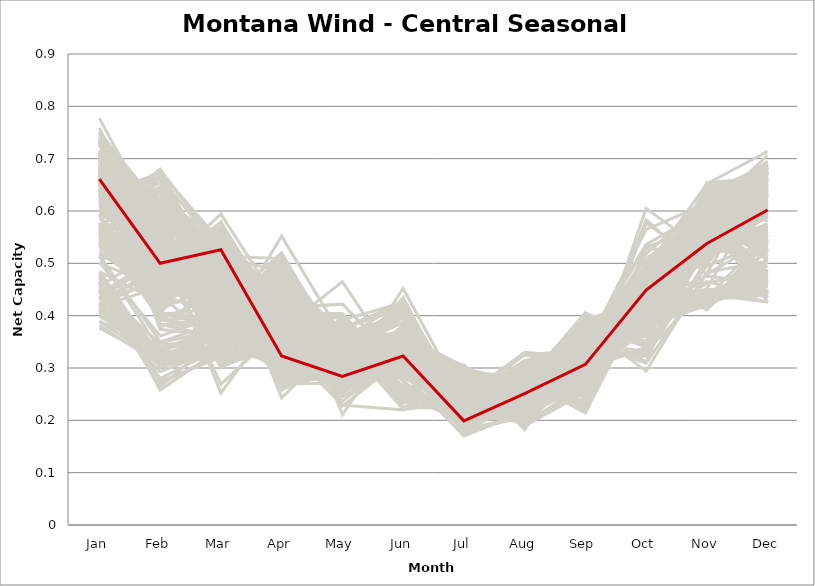
| Category | sample_001 | sample_002 | sample_003 | sample_004 | sample_005 | sample_006 | sample_007 | sample_008 | sample_009 | sample_010 | sample_011 | sample_012 | sample_013 | sample_014 | sample_015 | sample_016 | sample_017 | sample_018 | sample_019 | sample_020 | sample_021 | sample_022 | sample_023 | sample_024 | sample_025 | sample_026 | sample_027 | sample_028 | sample_029 | sample_030 | sample_031 | sample_032 | sample_033 | sample_034 | sample_035 | sample_036 | sample_037 | sample_038 | sample_039 | sample_040 | sample_041 | sample_042 | sample_043 | sample_044 | sample_045 | sample_046 | sample_047 | sample_048 | sample_049 | sample_050 | sample_051 | sample_052 | sample_053 | sample_054 | sample_055 | sample_056 | sample_057 | sample_058 | sample_059 | sample_060 | sample_061 | sample_062 | sample_063 | sample_064 | sample_065 | sample_066 | sample_067 | sample_068 | sample_069 | sample_070 | sample_071 | sample_072 | sample_073 | sample_074 | sample_075 | sample_076 | sample_077 | sample_078 | sample_079 | sample_080 | sample_081 | sample_082 | sample_083 | sample_084 | sample_085 | sample_086 | sample_087 | sample_088 | sample_089 | sample_090 | sample_091 | sample_092 | sample_093 | sample_094 | sample_095 | sample_096 | sample_097 | sample_098 | sample_099 | sample_100 | sample_101 | sample_102 | sample_103 | sample_104 | sample_105 | sample_106 | sample_107 | sample_108 | sample_109 | sample_110 | sample_111 | sample_112 | sample_113 | sample_114 | sample_115 | sample_116 | sample_117 | sample_118 | sample_119 | sample_120 | sample_121 | sample_122 | sample_123 | sample_124 | sample_125 | sample_126 | sample_127 | sample_128 | sample_129 | sample_130 | sample_131 | sample_132 | sample_133 | sample_134 | sample_135 | sample_136 | sample_137 | sample_138 | sample_139 | sample_140 | sample_141 | sample_142 | sample_143 | sample_144 | sample_145 | sample_146 | sample_147 | sample_148 | sample_149 | sample_150 | sample_151 | sample_152 | sample_153 | sample_154 | sample_155 | sample_156 | sample_157 | sample_158 | sample_159 | sample_160 | sample_161 | sample_162 | sample_163 | sample_164 | sample_165 | sample_166 | sample_167 | sample_168 | sample_169 | sample_170 | sample_171 | sample_172 | sample_173 | sample_174 | sample_175 | sample_176 | sample_177 | sample_178 | sample_179 | sample_180 | sample_181 | sample_182 | sample_183 | sample_184 | sample_185 | sample_186 | sample_187 | sample_188 | sample_189 | sample_190 | sample_191 | sample_192 | sample_193 | sample_194 | sample_195 | sample_196 | sample_197 | sample_198 | sample_199 | sample_200 | sample_201 | sample_202 | sample_203 | sample_204 | sample_205 | sample_206 | sample_207 | sample_208 | sample_209 | sample_210 | sample_211 | sample_212 | sample_213 | sample_214 | sample_215 | sample_216 | sample_217 | sample_218 | sample_219 | sample_220 | sample_221 | sample_222 | sample_223 | sample_224 | sample_225 | sample_226 | sample_227 | sample_228 | sample_229 | sample_230 | sample_231 | sample_232 | sample_233 | sample_234 | sample_235 | sample_236 | sample_237 | sample_238 | sample_239 | sample_240 | sample_241 | sample_242 | sample_243 | sample_244 | sample_245 | sample_246 | sample_248 | sample_249 | sample_250 | sample_247 |
|---|---|---|---|---|---|---|---|---|---|---|---|---|---|---|---|---|---|---|---|---|---|---|---|---|---|---|---|---|---|---|---|---|---|---|---|---|---|---|---|---|---|---|---|---|---|---|---|---|---|---|---|---|---|---|---|---|---|---|---|---|---|---|---|---|---|---|---|---|---|---|---|---|---|---|---|---|---|---|---|---|---|---|---|---|---|---|---|---|---|---|---|---|---|---|---|---|---|---|---|---|---|---|---|---|---|---|---|---|---|---|---|---|---|---|---|---|---|---|---|---|---|---|---|---|---|---|---|---|---|---|---|---|---|---|---|---|---|---|---|---|---|---|---|---|---|---|---|---|---|---|---|---|---|---|---|---|---|---|---|---|---|---|---|---|---|---|---|---|---|---|---|---|---|---|---|---|---|---|---|---|---|---|---|---|---|---|---|---|---|---|---|---|---|---|---|---|---|---|---|---|---|---|---|---|---|---|---|---|---|---|---|---|---|---|---|---|---|---|---|---|---|---|---|---|---|---|---|---|---|---|---|---|---|---|---|---|---|---|---|---|---|---|---|---|---|---|---|---|---|---|
| Jan | 0.621 | 0.557 | 0.735 | 0.737 | 0.617 | 0.653 | 0.407 | 0.652 | 0.611 | 0.617 | 0.731 | 0.464 | 0.679 | 0.735 | 0.689 | 0.401 | 0.566 | 0.708 | 0.647 | 0.686 | 0.565 | 0.466 | 0.376 | 0.615 | 0.647 | 0.456 | 0.674 | 0.637 | 0.403 | 0.737 | 0.569 | 0.703 | 0.543 | 0.635 | 0.535 | 0.485 | 0.417 | 0.399 | 0.44 | 0.649 | 0.662 | 0.609 | 0.734 | 0.559 | 0.777 | 0.456 | 0.675 | 0.632 | 0.571 | 0.556 | 0.462 | 0.48 | 0.626 | 0.602 | 0.5 | 0.669 | 0.664 | 0.736 | 0.652 | 0.711 | 0.515 | 0.432 | 0.436 | 0.726 | 0.619 | 0.641 | 0.615 | 0.532 | 0.432 | 0.615 | 0.647 | 0.636 | 0.668 | 0.551 | 0.594 | 0.751 | 0.585 | 0.643 | 0.632 | 0.55 | 0.665 | 0.623 | 0.711 | 0.666 | 0.619 | 0.641 | 0.611 | 0.732 | 0.666 | 0.688 | 0.657 | 0.455 | 0.437 | 0.418 | 0.647 | 0.746 | 0.652 | 0.573 | 0.586 | 0.537 | 0.616 | 0.657 | 0.701 | 0.684 | 0.657 | 0.678 | 0.448 | 0.561 | 0.521 | 0.659 | 0.605 | 0.674 | 0.636 | 0.632 | 0.694 | 0.546 | 0.715 | 0.654 | 0.732 | 0.647 | 0.728 | 0.54 | 0.527 | 0.56 | 0.464 | 0.381 | 0.614 | 0.569 | 0.649 | 0.671 | 0.659 | 0.619 | 0.659 | 0.635 | 0.658 | 0.633 | 0.455 | 0.63 | 0.534 | 0.656 | 0.54 | 0.434 | 0.682 | 0.665 | 0.7 | 0.735 | 0.672 | 0.654 | 0.759 | 0.475 | 0.411 | 0.426 | 0.75 | 0.441 | 0.664 | 0.674 | 0.569 | 0.605 | 0.684 | 0.641 | 0.429 | 0.627 | 0.705 | 0.553 | 0.64 | 0.389 | 0.646 | 0.389 | 0.409 | 0.671 | 0.547 | 0.578 | 0.577 | 0.7 | 0.547 | 0.556 | 0.643 | 0.745 | 0.567 | 0.54 | 0.412 | 0.54 | 0.573 | 0.7 | 0.661 | 0.666 | 0.665 | 0.683 | 0.661 | 0.594 | 0.564 | 0.613 | 0.741 | 0.594 | 0.512 | 0.423 | 0.548 | 0.41 | 0.451 | 0.716 | 0.539 | 0.513 | 0.64 | 0.659 | 0.484 | 0.59 | 0.664 | 0.687 | 0.64 | 0.588 | 0.707 | 0.535 | 0.621 | 0.564 | 0.67 | 0.417 | 0.675 | 0.502 | 0.447 | 0.648 | 0.733 | 0.588 | 0.422 | 0.653 | 0.572 | 0.601 | 0.682 | 0.644 | 0.606 | 0.609 | 0.68 | 0.601 | 0.595 | 0.726 | 0.656 | 0.571 | 0.674 | 0.619 | 0.543 | 0.655 | 0.629 | 0.672 | 0.562 | 0.697 | 0.515 | 0.472 | 0.674 | 0.553 | 0.729 | 0.661 |
| Feb | 0.46 | 0.439 | 0.538 | 0.406 | 0.661 | 0.524 | 0.311 | 0.44 | 0.677 | 0.57 | 0.59 | 0.315 | 0.448 | 0.523 | 0.48 | 0.314 | 0.604 | 0.379 | 0.476 | 0.586 | 0.466 | 0.32 | 0.315 | 0.495 | 0.51 | 0.529 | 0.503 | 0.621 | 0.323 | 0.609 | 0.493 | 0.526 | 0.402 | 0.559 | 0.424 | 0.317 | 0.318 | 0.332 | 0.508 | 0.438 | 0.475 | 0.623 | 0.4 | 0.394 | 0.564 | 0.32 | 0.488 | 0.421 | 0.517 | 0.404 | 0.33 | 0.313 | 0.559 | 0.667 | 0.454 | 0.43 | 0.437 | 0.59 | 0.621 | 0.539 | 0.35 | 0.48 | 0.327 | 0.564 | 0.567 | 0.537 | 0.617 | 0.473 | 0.465 | 0.653 | 0.507 | 0.524 | 0.51 | 0.501 | 0.405 | 0.605 | 0.507 | 0.622 | 0.672 | 0.513 | 0.515 | 0.665 | 0.392 | 0.456 | 0.536 | 0.617 | 0.535 | 0.383 | 0.571 | 0.443 | 0.577 | 0.345 | 0.348 | 0.305 | 0.663 | 0.589 | 0.476 | 0.5 | 0.643 | 0.409 | 0.586 | 0.624 | 0.577 | 0.459 | 0.538 | 0.544 | 0.28 | 0.415 | 0.439 | 0.424 | 0.598 | 0.472 | 0.42 | 0.43 | 0.382 | 0.487 | 0.545 | 0.542 | 0.516 | 0.555 | 0.584 | 0.432 | 0.466 | 0.466 | 0.318 | 0.308 | 0.608 | 0.436 | 0.493 | 0.518 | 0.489 | 0.526 | 0.604 | 0.486 | 0.501 | 0.644 | 0.317 | 0.665 | 0.509 | 0.471 | 0.419 | 0.506 | 0.512 | 0.466 | 0.438 | 0.555 | 0.479 | 0.573 | 0.512 | 0.258 | 0.338 | 0.329 | 0.566 | 0.516 | 0.496 | 0.612 | 0.55 | 0.632 | 0.488 | 0.504 | 0.491 | 0.412 | 0.456 | 0.663 | 0.514 | 0.338 | 0.536 | 0.314 | 0.315 | 0.483 | 0.501 | 0.419 | 0.468 | 0.487 | 0.543 | 0.5 | 0.553 | 0.594 | 0.416 | 0.406 | 0.293 | 0.468 | 0.444 | 0.532 | 0.447 | 0.576 | 0.472 | 0.374 | 0.492 | 0.56 | 0.598 | 0.583 | 0.598 | 0.646 | 0.486 | 0.302 | 0.44 | 0.334 | 0.264 | 0.453 | 0.501 | 0.334 | 0.516 | 0.537 | 0.426 | 0.6 | 0.577 | 0.383 | 0.51 | 0.68 | 0.392 | 0.431 | 0.592 | 0.478 | 0.515 | 0.455 | 0.518 | 0.361 | 0.27 | 0.624 | 0.54 | 0.635 | 0.47 | 0.479 | 0.639 | 0.621 | 0.557 | 0.555 | 0.675 | 0.597 | 0.605 | 0.549 | 0.523 | 0.589 | 0.56 | 0.582 | 0.491 | 0.66 | 0.498 | 0.464 | 0.444 | 0.562 | 0.431 | 0.455 | 0.518 | 0.275 | 0.494 | 0.433 | 0.594 | 0.5 |
| Mar | 0.534 | 0.502 | 0.314 | 0.393 | 0.476 | 0.428 | 0.333 | 0.55 | 0.536 | 0.449 | 0.328 | 0.336 | 0.423 | 0.269 | 0.555 | 0.362 | 0.537 | 0.401 | 0.54 | 0.346 | 0.525 | 0.341 | 0.349 | 0.535 | 0.521 | 0.455 | 0.39 | 0.532 | 0.366 | 0.302 | 0.481 | 0.533 | 0.385 | 0.421 | 0.526 | 0.344 | 0.346 | 0.377 | 0.436 | 0.495 | 0.386 | 0.531 | 0.417 | 0.44 | 0.319 | 0.337 | 0.555 | 0.508 | 0.443 | 0.543 | 0.34 | 0.318 | 0.542 | 0.466 | 0.491 | 0.501 | 0.519 | 0.381 | 0.548 | 0.547 | 0.388 | 0.463 | 0.343 | 0.404 | 0.382 | 0.416 | 0.45 | 0.468 | 0.476 | 0.445 | 0.411 | 0.407 | 0.402 | 0.472 | 0.548 | 0.315 | 0.477 | 0.514 | 0.542 | 0.481 | 0.538 | 0.522 | 0.375 | 0.544 | 0.551 | 0.549 | 0.473 | 0.386 | 0.421 | 0.554 | 0.44 | 0.35 | 0.375 | 0.34 | 0.486 | 0.388 | 0.552 | 0.488 | 0.455 | 0.534 | 0.457 | 0.391 | 0.333 | 0.579 | 0.41 | 0.384 | 0.339 | 0.539 | 0.343 | 0.504 | 0.428 | 0.52 | 0.488 | 0.525 | 0.38 | 0.508 | 0.535 | 0.386 | 0.561 | 0.422 | 0.307 | 0.533 | 0.463 | 0.503 | 0.359 | 0.361 | 0.483 | 0.532 | 0.401 | 0.427 | 0.579 | 0.476 | 0.424 | 0.53 | 0.387 | 0.436 | 0.33 | 0.413 | 0.456 | 0.422 | 0.538 | 0.438 | 0.391 | 0.56 | 0.404 | 0.494 | 0.399 | 0.404 | 0.301 | 0.337 | 0.356 | 0.34 | 0.305 | 0.447 | 0.523 | 0.403 | 0.484 | 0.526 | 0.375 | 0.43 | 0.468 | 0.462 | 0.421 | 0.441 | 0.555 | 0.367 | 0.566 | 0.344 | 0.386 | 0.536 | 0.468 | 0.539 | 0.53 | 0.594 | 0.448 | 0.433 | 0.395 | 0.312 | 0.537 | 0.538 | 0.338 | 0.519 | 0.537 | 0.421 | 0.514 | 0.397 | 0.568 | 0.359 | 0.383 | 0.529 | 0.54 | 0.507 | 0.357 | 0.36 | 0.475 | 0.332 | 0.473 | 0.362 | 0.362 | 0.511 | 0.508 | 0.381 | 0.562 | 0.416 | 0.426 | 0.491 | 0.424 | 0.358 | 0.541 | 0.522 | 0.398 | 0.538 | 0.439 | 0.518 | 0.39 | 0.423 | 0.53 | 0.401 | 0.328 | 0.44 | 0.252 | 0.44 | 0.457 | 0.398 | 0.435 | 0.455 | 0.432 | 0.395 | 0.466 | 0.425 | 0.41 | 0.446 | 0.488 | 0.391 | 0.401 | 0.515 | 0.408 | 0.467 | 0.487 | 0.545 | 0.536 | 0.4 | 0.46 | 0.57 | 0.41 | 0.32 | 0.417 | 0.537 | 0.302 | 0.526 |
| Apr | 0.4 | 0.318 | 0.369 | 0.326 | 0.388 | 0.497 | 0.358 | 0.295 | 0.397 | 0.333 | 0.327 | 0.434 | 0.284 | 0.376 | 0.331 | 0.502 | 0.343 | 0.348 | 0.315 | 0.301 | 0.291 | 0.381 | 0.478 | 0.284 | 0.301 | 0.391 | 0.475 | 0.398 | 0.514 | 0.347 | 0.285 | 0.393 | 0.373 | 0.297 | 0.286 | 0.421 | 0.486 | 0.514 | 0.42 | 0.371 | 0.502 | 0.374 | 0.301 | 0.302 | 0.362 | 0.363 | 0.336 | 0.317 | 0.272 | 0.259 | 0.379 | 0.391 | 0.428 | 0.397 | 0.316 | 0.373 | 0.342 | 0.325 | 0.376 | 0.433 | 0.404 | 0.335 | 0.438 | 0.34 | 0.425 | 0.329 | 0.304 | 0.306 | 0.355 | 0.422 | 0.293 | 0.382 | 0.475 | 0.277 | 0.274 | 0.347 | 0.266 | 0.412 | 0.365 | 0.301 | 0.32 | 0.353 | 0.363 | 0.309 | 0.401 | 0.391 | 0.298 | 0.341 | 0.342 | 0.397 | 0.451 | 0.422 | 0.469 | 0.435 | 0.402 | 0.352 | 0.314 | 0.258 | 0.367 | 0.261 | 0.292 | 0.485 | 0.328 | 0.39 | 0.465 | 0.467 | 0.398 | 0.279 | 0.415 | 0.36 | 0.424 | 0.335 | 0.332 | 0.31 | 0.334 | 0.284 | 0.426 | 0.447 | 0.415 | 0.339 | 0.344 | 0.258 | 0.322 | 0.317 | 0.456 | 0.472 | 0.376 | 0.261 | 0.279 | 0.327 | 0.335 | 0.276 | 0.474 | 0.315 | 0.459 | 0.444 | 0.386 | 0.481 | 0.303 | 0.323 | 0.272 | 0.424 | 0.509 | 0.343 | 0.301 | 0.465 | 0.5 | 0.358 | 0.387 | 0.409 | 0.491 | 0.39 | 0.361 | 0.413 | 0.331 | 0.475 | 0.347 | 0.34 | 0.507 | 0.444 | 0.314 | 0.399 | 0.3 | 0.343 | 0.406 | 0.467 | 0.413 | 0.494 | 0.5 | 0.346 | 0.26 | 0.264 | 0.294 | 0.414 | 0.323 | 0.288 | 0.459 | 0.356 | 0.294 | 0.243 | 0.44 | 0.284 | 0.296 | 0.352 | 0.509 | 0.459 | 0.413 | 0.315 | 0.494 | 0.413 | 0.327 | 0.382 | 0.303 | 0.552 | 0.316 | 0.439 | 0.324 | 0.496 | 0.421 | 0.486 | 0.275 | 0.41 | 0.405 | 0.486 | 0.287 | 0.351 | 0.344 | 0.317 | 0.315 | 0.38 | 0.313 | 0.273 | 0.431 | 0.279 | 0.517 | 0.421 | 0.382 | 0.408 | 0.425 | 0.448 | 0.412 | 0.375 | 0.317 | 0.494 | 0.325 | 0.391 | 0.359 | 0.486 | 0.376 | 0.417 | 0.48 | 0.302 | 0.27 | 0.288 | 0.462 | 0.339 | 0.51 | 0.404 | 0.29 | 0.32 | 0.31 | 0.351 | 0.314 | 0.382 | 0.283 | 0.421 | 0.52 | 0.303 | 0.362 | 0.323 |
| May | 0.353 | 0.313 | 0.292 | 0.344 | 0.298 | 0.311 | 0.349 | 0.284 | 0.324 | 0.279 | 0.332 | 0.314 | 0.393 | 0.327 | 0.287 | 0.258 | 0.334 | 0.323 | 0.289 | 0.329 | 0.297 | 0.345 | 0.28 | 0.31 | 0.306 | 0.276 | 0.36 | 0.296 | 0.27 | 0.32 | 0.294 | 0.376 | 0.465 | 0.385 | 0.339 | 0.311 | 0.28 | 0.267 | 0.295 | 0.246 | 0.349 | 0.303 | 0.366 | 0.328 | 0.298 | 0.343 | 0.279 | 0.265 | 0.315 | 0.363 | 0.344 | 0.346 | 0.323 | 0.309 | 0.318 | 0.252 | 0.261 | 0.342 | 0.314 | 0.375 | 0.404 | 0.277 | 0.311 | 0.341 | 0.275 | 0.376 | 0.26 | 0.338 | 0.277 | 0.299 | 0.391 | 0.281 | 0.346 | 0.314 | 0.345 | 0.329 | 0.289 | 0.32 | 0.351 | 0.289 | 0.281 | 0.345 | 0.325 | 0.277 | 0.336 | 0.301 | 0.267 | 0.339 | 0.379 | 0.339 | 0.338 | 0.326 | 0.275 | 0.289 | 0.289 | 0.342 | 0.281 | 0.315 | 0.306 | 0.358 | 0.289 | 0.333 | 0.342 | 0.355 | 0.355 | 0.359 | 0.373 | 0.337 | 0.422 | 0.236 | 0.27 | 0.287 | 0.268 | 0.292 | 0.35 | 0.297 | 0.392 | 0.35 | 0.346 | 0.362 | 0.332 | 0.352 | 0.325 | 0.313 | 0.279 | 0.257 | 0.318 | 0.355 | 0.399 | 0.356 | 0.28 | 0.287 | 0.352 | 0.292 | 0.356 | 0.361 | 0.343 | 0.367 | 0.29 | 0.378 | 0.338 | 0.283 | 0.34 | 0.27 | 0.392 | 0.275 | 0.321 | 0.355 | 0.317 | 0.374 | 0.266 | 0.337 | 0.311 | 0.285 | 0.278 | 0.341 | 0.229 | 0.329 | 0.319 | 0.302 | 0.29 | 0.245 | 0.391 | 0.334 | 0.333 | 0.268 | 0.337 | 0.271 | 0.267 | 0.266 | 0.313 | 0.361 | 0.305 | 0.327 | 0.273 | 0.313 | 0.309 | 0.297 | 0.329 | 0.355 | 0.288 | 0.313 | 0.329 | 0.355 | 0.211 | 0.347 | 0.333 | 0.358 | 0.325 | 0.319 | 0.341 | 0.312 | 0.354 | 0.359 | 0.306 | 0.282 | 0.314 | 0.255 | 0.375 | 0.227 | 0.303 | 0.395 | 0.341 | 0.313 | 0.346 | 0.33 | 0.353 | 0.369 | 0.29 | 0.349 | 0.364 | 0.341 | 0.265 | 0.301 | 0.317 | 0.292 | 0.375 | 0.398 | 0.347 | 0.26 | 0.297 | 0.314 | 0.295 | 0.334 | 0.349 | 0.304 | 0.37 | 0.29 | 0.305 | 0.258 | 0.345 | 0.28 | 0.271 | 0.364 | 0.331 | 0.351 | 0.336 | 0.292 | 0.306 | 0.279 | 0.282 | 0.358 | 0.323 | 0.358 | 0.288 | 0.361 | 0.324 | 0.325 | 0.32 | 0.284 |
| Jun | 0.369 | 0.295 | 0.289 | 0.25 | 0.347 | 0.32 | 0.343 | 0.317 | 0.355 | 0.33 | 0.305 | 0.328 | 0.243 | 0.265 | 0.329 | 0.309 | 0.298 | 0.252 | 0.334 | 0.327 | 0.352 | 0.357 | 0.29 | 0.345 | 0.316 | 0.364 | 0.335 | 0.37 | 0.293 | 0.304 | 0.417 | 0.425 | 0.291 | 0.225 | 0.297 | 0.32 | 0.305 | 0.297 | 0.365 | 0.302 | 0.334 | 0.365 | 0.249 | 0.344 | 0.294 | 0.344 | 0.327 | 0.319 | 0.298 | 0.297 | 0.363 | 0.34 | 0.41 | 0.341 | 0.367 | 0.324 | 0.329 | 0.336 | 0.353 | 0.426 | 0.276 | 0.366 | 0.314 | 0.334 | 0.283 | 0.24 | 0.319 | 0.353 | 0.37 | 0.338 | 0.256 | 0.29 | 0.338 | 0.318 | 0.301 | 0.298 | 0.31 | 0.357 | 0.348 | 0.41 | 0.339 | 0.347 | 0.257 | 0.317 | 0.422 | 0.36 | 0.329 | 0.245 | 0.237 | 0.404 | 0.371 | 0.337 | 0.307 | 0.322 | 0.351 | 0.339 | 0.329 | 0.318 | 0.359 | 0.296 | 0.309 | 0.358 | 0.294 | 0.427 | 0.356 | 0.346 | 0.345 | 0.288 | 0.303 | 0.33 | 0.327 | 0.322 | 0.327 | 0.32 | 0.25 | 0.361 | 0.425 | 0.354 | 0.413 | 0.234 | 0.292 | 0.303 | 0.349 | 0.295 | 0.314 | 0.316 | 0.354 | 0.292 | 0.248 | 0.261 | 0.336 | 0.32 | 0.353 | 0.314 | 0.344 | 0.355 | 0.337 | 0.362 | 0.435 | 0.264 | 0.304 | 0.362 | 0.337 | 0.338 | 0.245 | 0.327 | 0.339 | 0.246 | 0.267 | 0.332 | 0.291 | 0.338 | 0.279 | 0.357 | 0.322 | 0.355 | 0.22 | 0.369 | 0.328 | 0.318 | 0.381 | 0.317 | 0.242 | 0.336 | 0.396 | 0.304 | 0.415 | 0.301 | 0.308 | 0.319 | 0.311 | 0.282 | 0.365 | 0.395 | 0.452 | 0.318 | 0.352 | 0.295 | 0.325 | 0.297 | 0.319 | 0.368 | 0.299 | 0.221 | 0.378 | 0.351 | 0.387 | 0.242 | 0.332 | 0.413 | 0.306 | 0.294 | 0.323 | 0.384 | 0.363 | 0.317 | 0.356 | 0.309 | 0.341 | 0.319 | 0.366 | 0.274 | 0.415 | 0.32 | 0.329 | 0.354 | 0.251 | 0.252 | 0.339 | 0.338 | 0.242 | 0.286 | 0.316 | 0.349 | 0.339 | 0.352 | 0.415 | 0.275 | 0.333 | 0.31 | 0.283 | 0.349 | 0.368 | 0.337 | 0.341 | 0.346 | 0.226 | 0.351 | 0.34 | 0.33 | 0.331 | 0.322 | 0.328 | 0.344 | 0.365 | 0.299 | 0.333 | 0.347 | 0.399 | 0.323 | 0.325 | 0.237 | 0.342 | 0.408 | 0.315 | 0.333 | 0.355 | 0.302 | 0.31 | 0.323 |
| Jul | 0.197 | 0.235 | 0.24 | 0.228 | 0.27 | 0.268 | 0.257 | 0.187 | 0.273 | 0.268 | 0.243 | 0.265 | 0.202 | 0.253 | 0.181 | 0.234 | 0.235 | 0.211 | 0.183 | 0.234 | 0.219 | 0.248 | 0.248 | 0.2 | 0.214 | 0.295 | 0.279 | 0.278 | 0.244 | 0.246 | 0.214 | 0.215 | 0.17 | 0.223 | 0.225 | 0.254 | 0.246 | 0.239 | 0.298 | 0.2 | 0.29 | 0.251 | 0.212 | 0.255 | 0.241 | 0.248 | 0.182 | 0.193 | 0.244 | 0.234 | 0.257 | 0.257 | 0.2 | 0.278 | 0.257 | 0.198 | 0.188 | 0.224 | 0.241 | 0.226 | 0.18 | 0.291 | 0.264 | 0.222 | 0.213 | 0.24 | 0.306 | 0.259 | 0.276 | 0.296 | 0.198 | 0.2 | 0.284 | 0.24 | 0.231 | 0.238 | 0.256 | 0.277 | 0.266 | 0.216 | 0.202 | 0.264 | 0.228 | 0.192 | 0.197 | 0.262 | 0.25 | 0.217 | 0.237 | 0.2 | 0.272 | 0.263 | 0.249 | 0.267 | 0.279 | 0.232 | 0.191 | 0.227 | 0.245 | 0.242 | 0.286 | 0.293 | 0.241 | 0.199 | 0.285 | 0.297 | 0.263 | 0.221 | 0.174 | 0.201 | 0.207 | 0.18 | 0.206 | 0.192 | 0.225 | 0.223 | 0.235 | 0.287 | 0.193 | 0.236 | 0.247 | 0.231 | 0.263 | 0.247 | 0.258 | 0.241 | 0.278 | 0.24 | 0.201 | 0.199 | 0.183 | 0.248 | 0.284 | 0.213 | 0.288 | 0.284 | 0.268 | 0.262 | 0.215 | 0.204 | 0.231 | 0.303 | 0.299 | 0.196 | 0.204 | 0.297 | 0.272 | 0.228 | 0.252 | 0.277 | 0.242 | 0.263 | 0.252 | 0.297 | 0.2 | 0.291 | 0.261 | 0.259 | 0.286 | 0.27 | 0.283 | 0.197 | 0.214 | 0.284 | 0.199 | 0.245 | 0.207 | 0.241 | 0.232 | 0.197 | 0.235 | 0.24 | 0.214 | 0.202 | 0.238 | 0.224 | 0.264 | 0.242 | 0.232 | 0.225 | 0.27 | 0.225 | 0.228 | 0.234 | 0.245 | 0.291 | 0.211 | 0.221 | 0.297 | 0.192 | 0.25 | 0.24 | 0.237 | 0.243 | 0.256 | 0.259 | 0.276 | 0.243 | 0.28 | 0.302 | 0.217 | 0.195 | 0.2 | 0.264 | 0.267 | 0.278 | 0.238 | 0.227 | 0.208 | 0.284 | 0.224 | 0.238 | 0.214 | 0.219 | 0.29 | 0.289 | 0.217 | 0.182 | 0.269 | 0.209 | 0.25 | 0.259 | 0.285 | 0.294 | 0.271 | 0.277 | 0.254 | 0.275 | 0.273 | 0.211 | 0.3 | 0.249 | 0.259 | 0.226 | 0.27 | 0.244 | 0.292 | 0.273 | 0.218 | 0.193 | 0.194 | 0.229 | 0.259 | 0.203 | 0.214 | 0.274 | 0.294 | 0.234 | 0.245 | 0.199 |
| Aug | 0.253 | 0.301 | 0.203 | 0.272 | 0.275 | 0.243 | 0.273 | 0.247 | 0.24 | 0.219 | 0.196 | 0.255 | 0.284 | 0.196 | 0.237 | 0.304 | 0.193 | 0.281 | 0.246 | 0.198 | 0.264 | 0.271 | 0.326 | 0.251 | 0.242 | 0.255 | 0.235 | 0.284 | 0.33 | 0.201 | 0.234 | 0.227 | 0.216 | 0.281 | 0.282 | 0.252 | 0.278 | 0.325 | 0.23 | 0.249 | 0.237 | 0.276 | 0.278 | 0.277 | 0.194 | 0.274 | 0.237 | 0.244 | 0.226 | 0.255 | 0.26 | 0.272 | 0.252 | 0.271 | 0.28 | 0.232 | 0.241 | 0.201 | 0.249 | 0.216 | 0.206 | 0.276 | 0.271 | 0.203 | 0.213 | 0.258 | 0.208 | 0.275 | 0.279 | 0.278 | 0.292 | 0.206 | 0.238 | 0.208 | 0.253 | 0.201 | 0.228 | 0.277 | 0.235 | 0.235 | 0.249 | 0.234 | 0.276 | 0.242 | 0.262 | 0.269 | 0.218 | 0.271 | 0.276 | 0.24 | 0.256 | 0.258 | 0.288 | 0.294 | 0.269 | 0.208 | 0.249 | 0.204 | 0.273 | 0.259 | 0.195 | 0.264 | 0.2 | 0.244 | 0.244 | 0.24 | 0.26 | 0.291 | 0.212 | 0.238 | 0.216 | 0.238 | 0.244 | 0.246 | 0.278 | 0.254 | 0.218 | 0.248 | 0.226 | 0.265 | 0.205 | 0.265 | 0.289 | 0.288 | 0.277 | 0.305 | 0.276 | 0.254 | 0.291 | 0.276 | 0.238 | 0.214 | 0.266 | 0.237 | 0.244 | 0.239 | 0.253 | 0.278 | 0.227 | 0.279 | 0.282 | 0.243 | 0.229 | 0.25 | 0.281 | 0.202 | 0.24 | 0.261 | 0.195 | 0.25 | 0.31 | 0.257 | 0.201 | 0.253 | 0.249 | 0.264 | 0.277 | 0.29 | 0.246 | 0.254 | 0.27 | 0.251 | 0.288 | 0.278 | 0.251 | 0.326 | 0.254 | 0.314 | 0.309 | 0.241 | 0.214 | 0.258 | 0.256 | 0.247 | 0.214 | 0.21 | 0.232 | 0.203 | 0.259 | 0.257 | 0.285 | 0.239 | 0.278 | 0.256 | 0.215 | 0.259 | 0.257 | 0.281 | 0.234 | 0.27 | 0.189 | 0.194 | 0.191 | 0.308 | 0.275 | 0.285 | 0.285 | 0.298 | 0.26 | 0.182 | 0.236 | 0.218 | 0.262 | 0.242 | 0.288 | 0.281 | 0.264 | 0.285 | 0.25 | 0.241 | 0.272 | 0.274 | 0.203 | 0.256 | 0.235 | 0.24 | 0.232 | 0.209 | 0.262 | 0.209 | 0.196 | 0.286 | 0.282 | 0.24 | 0.27 | 0.27 | 0.262 | 0.236 | 0.262 | 0.206 | 0.264 | 0.22 | 0.224 | 0.205 | 0.25 | 0.193 | 0.237 | 0.274 | 0.241 | 0.25 | 0.256 | 0.273 | 0.28 | 0.237 | 0.196 | 0.253 | 0.23 | 0.284 | 0.2 | 0.251 |
| Sep | 0.381 | 0.243 | 0.349 | 0.326 | 0.231 | 0.29 | 0.394 | 0.328 | 0.271 | 0.356 | 0.331 | 0.389 | 0.339 | 0.348 | 0.328 | 0.36 | 0.27 | 0.359 | 0.317 | 0.319 | 0.302 | 0.378 | 0.333 | 0.275 | 0.272 | 0.356 | 0.282 | 0.233 | 0.32 | 0.35 | 0.331 | 0.307 | 0.269 | 0.294 | 0.266 | 0.363 | 0.364 | 0.324 | 0.351 | 0.332 | 0.291 | 0.233 | 0.332 | 0.377 | 0.351 | 0.373 | 0.308 | 0.369 | 0.353 | 0.282 | 0.378 | 0.371 | 0.293 | 0.219 | 0.395 | 0.356 | 0.366 | 0.293 | 0.24 | 0.313 | 0.281 | 0.389 | 0.377 | 0.293 | 0.345 | 0.275 | 0.333 | 0.37 | 0.391 | 0.229 | 0.311 | 0.393 | 0.291 | 0.351 | 0.289 | 0.334 | 0.353 | 0.214 | 0.286 | 0.321 | 0.303 | 0.282 | 0.324 | 0.323 | 0.298 | 0.246 | 0.363 | 0.325 | 0.279 | 0.319 | 0.256 | 0.383 | 0.357 | 0.354 | 0.222 | 0.283 | 0.31 | 0.351 | 0.251 | 0.287 | 0.368 | 0.305 | 0.345 | 0.307 | 0.276 | 0.282 | 0.351 | 0.264 | 0.265 | 0.352 | 0.311 | 0.322 | 0.345 | 0.357 | 0.345 | 0.319 | 0.314 | 0.294 | 0.276 | 0.272 | 0.344 | 0.289 | 0.361 | 0.252 | 0.354 | 0.361 | 0.219 | 0.304 | 0.302 | 0.291 | 0.308 | 0.364 | 0.294 | 0.269 | 0.285 | 0.325 | 0.398 | 0.316 | 0.346 | 0.289 | 0.274 | 0.351 | 0.299 | 0.321 | 0.331 | 0.31 | 0.297 | 0.269 | 0.334 | 0.349 | 0.34 | 0.373 | 0.338 | 0.353 | 0.292 | 0.302 | 0.375 | 0.232 | 0.29 | 0.301 | 0.406 | 0.358 | 0.332 | 0.221 | 0.307 | 0.33 | 0.307 | 0.348 | 0.349 | 0.304 | 0.363 | 0.279 | 0.3 | 0.305 | 0.352 | 0.357 | 0.295 | 0.341 | 0.283 | 0.298 | 0.361 | 0.319 | 0.265 | 0.28 | 0.346 | 0.279 | 0.321 | 0.343 | 0.307 | 0.293 | 0.254 | 0.263 | 0.304 | 0.316 | 0.389 | 0.353 | 0.368 | 0.36 | 0.346 | 0.345 | 0.324 | 0.266 | 0.302 | 0.296 | 0.385 | 0.226 | 0.278 | 0.345 | 0.266 | 0.28 | 0.346 | 0.284 | 0.281 | 0.305 | 0.287 | 0.344 | 0.309 | 0.269 | 0.368 | 0.302 | 0.335 | 0.254 | 0.382 | 0.296 | 0.229 | 0.229 | 0.267 | 0.304 | 0.228 | 0.301 | 0.33 | 0.365 | 0.35 | 0.286 | 0.273 | 0.261 | 0.288 | 0.231 | 0.338 | 0.33 | 0.351 | 0.263 | 0.36 | 0.305 | 0.36 | 0.351 | 0.299 | 0.258 | 0.349 | 0.307 |
| Oct | 0.294 | 0.462 | 0.456 | 0.485 | 0.485 | 0.498 | 0.38 | 0.452 | 0.396 | 0.418 | 0.448 | 0.402 | 0.455 | 0.536 | 0.453 | 0.446 | 0.411 | 0.496 | 0.435 | 0.456 | 0.336 | 0.406 | 0.449 | 0.442 | 0.468 | 0.348 | 0.417 | 0.433 | 0.464 | 0.442 | 0.327 | 0.431 | 0.503 | 0.437 | 0.441 | 0.398 | 0.441 | 0.472 | 0.39 | 0.486 | 0.429 | 0.446 | 0.469 | 0.421 | 0.442 | 0.39 | 0.455 | 0.448 | 0.471 | 0.41 | 0.395 | 0.407 | 0.464 | 0.488 | 0.351 | 0.466 | 0.451 | 0.416 | 0.412 | 0.406 | 0.583 | 0.344 | 0.416 | 0.425 | 0.417 | 0.399 | 0.422 | 0.402 | 0.349 | 0.493 | 0.459 | 0.425 | 0.412 | 0.47 | 0.385 | 0.443 | 0.472 | 0.443 | 0.393 | 0.327 | 0.434 | 0.408 | 0.488 | 0.453 | 0.452 | 0.44 | 0.469 | 0.498 | 0.425 | 0.431 | 0.428 | 0.404 | 0.457 | 0.422 | 0.471 | 0.407 | 0.442 | 0.458 | 0.498 | 0.4 | 0.418 | 0.397 | 0.455 | 0.432 | 0.406 | 0.413 | 0.384 | 0.447 | 0.528 | 0.48 | 0.392 | 0.445 | 0.457 | 0.44 | 0.477 | 0.33 | 0.414 | 0.403 | 0.464 | 0.414 | 0.441 | 0.412 | 0.427 | 0.471 | 0.425 | 0.427 | 0.459 | 0.371 | 0.455 | 0.444 | 0.452 | 0.465 | 0.381 | 0.472 | 0.41 | 0.386 | 0.402 | 0.41 | 0.332 | 0.457 | 0.43 | 0.37 | 0.439 | 0.453 | 0.45 | 0.492 | 0.465 | 0.435 | 0.518 | 0.375 | 0.459 | 0.384 | 0.464 | 0.36 | 0.446 | 0.395 | 0.312 | 0.438 | 0.463 | 0.49 | 0.345 | 0.484 | 0.453 | 0.486 | 0.441 | 0.452 | 0.443 | 0.458 | 0.445 | 0.47 | 0.476 | 0.401 | 0.34 | 0.449 | 0.309 | 0.489 | 0.454 | 0.449 | 0.373 | 0.376 | 0.423 | 0.333 | 0.44 | 0.41 | 0.509 | 0.413 | 0.438 | 0.473 | 0.431 | 0.485 | 0.436 | 0.436 | 0.424 | 0.382 | 0.363 | 0.424 | 0.406 | 0.438 | 0.382 | 0.531 | 0.323 | 0.605 | 0.433 | 0.487 | 0.398 | 0.449 | 0.42 | 0.47 | 0.438 | 0.396 | 0.47 | 0.419 | 0.43 | 0.336 | 0.459 | 0.388 | 0.413 | 0.577 | 0.41 | 0.418 | 0.565 | 0.483 | 0.34 | 0.427 | 0.484 | 0.457 | 0.395 | 0.463 | 0.478 | 0.403 | 0.406 | 0.464 | 0.457 | 0.393 | 0.416 | 0.406 | 0.434 | 0.501 | 0.324 | 0.46 | 0.438 | 0.432 | 0.424 | 0.439 | 0.492 | 0.382 | 0.42 | 0.435 | 0.436 | 0.449 |
| Nov | 0.483 | 0.55 | 0.612 | 0.614 | 0.61 | 0.634 | 0.42 | 0.521 | 0.569 | 0.519 | 0.566 | 0.445 | 0.575 | 0.603 | 0.55 | 0.423 | 0.534 | 0.553 | 0.532 | 0.562 | 0.54 | 0.429 | 0.416 | 0.529 | 0.511 | 0.649 | 0.608 | 0.57 | 0.418 | 0.594 | 0.496 | 0.554 | 0.53 | 0.576 | 0.535 | 0.461 | 0.448 | 0.411 | 0.598 | 0.563 | 0.629 | 0.562 | 0.582 | 0.601 | 0.63 | 0.427 | 0.547 | 0.526 | 0.545 | 0.519 | 0.434 | 0.446 | 0.622 | 0.599 | 0.597 | 0.572 | 0.531 | 0.648 | 0.583 | 0.528 | 0.479 | 0.608 | 0.439 | 0.618 | 0.544 | 0.579 | 0.525 | 0.612 | 0.613 | 0.611 | 0.596 | 0.507 | 0.637 | 0.575 | 0.528 | 0.602 | 0.541 | 0.588 | 0.57 | 0.497 | 0.549 | 0.567 | 0.596 | 0.518 | 0.6 | 0.572 | 0.546 | 0.582 | 0.59 | 0.581 | 0.577 | 0.444 | 0.463 | 0.451 | 0.617 | 0.654 | 0.534 | 0.568 | 0.601 | 0.536 | 0.51 | 0.631 | 0.557 | 0.549 | 0.62 | 0.614 | 0.432 | 0.548 | 0.524 | 0.534 | 0.556 | 0.543 | 0.534 | 0.521 | 0.573 | 0.547 | 0.546 | 0.616 | 0.562 | 0.591 | 0.583 | 0.529 | 0.612 | 0.551 | 0.476 | 0.428 | 0.603 | 0.534 | 0.585 | 0.596 | 0.543 | 0.547 | 0.63 | 0.501 | 0.616 | 0.642 | 0.421 | 0.596 | 0.451 | 0.589 | 0.539 | 0.615 | 0.627 | 0.523 | 0.588 | 0.557 | 0.602 | 0.582 | 0.62 | 0.435 | 0.434 | 0.431 | 0.626 | 0.65 | 0.557 | 0.641 | 0.566 | 0.564 | 0.624 | 0.652 | 0.584 | 0.553 | 0.598 | 0.602 | 0.599 | 0.415 | 0.61 | 0.416 | 0.413 | 0.563 | 0.568 | 0.521 | 0.53 | 0.579 | 0.481 | 0.583 | 0.623 | 0.618 | 0.519 | 0.523 | 0.441 | 0.538 | 0.552 | 0.576 | 0.588 | 0.586 | 0.598 | 0.571 | 0.611 | 0.594 | 0.527 | 0.563 | 0.617 | 0.56 | 0.606 | 0.465 | 0.621 | 0.429 | 0.434 | 0.57 | 0.535 | 0.52 | 0.593 | 0.627 | 0.596 | 0.571 | 0.593 | 0.574 | 0.537 | 0.56 | 0.581 | 0.545 | 0.545 | 0.533 | 0.622 | 0.611 | 0.545 | 0.495 | 0.431 | 0.558 | 0.614 | 0.59 | 0.616 | 0.62 | 0.605 | 0.603 | 0.589 | 0.623 | 0.603 | 0.55 | 0.639 | 0.513 | 0.549 | 0.641 | 0.593 | 0.532 | 0.63 | 0.612 | 0.507 | 0.52 | 0.514 | 0.598 | 0.599 | 0.563 | 0.569 | 0.436 | 0.613 | 0.564 | 0.592 | 0.538 |
| Dec | 0.504 | 0.54 | 0.648 | 0.442 | 0.542 | 0.689 | 0.47 | 0.658 | 0.535 | 0.589 | 0.659 | 0.48 | 0.435 | 0.684 | 0.631 | 0.502 | 0.55 | 0.466 | 0.609 | 0.673 | 0.67 | 0.478 | 0.553 | 0.65 | 0.638 | 0.599 | 0.654 | 0.546 | 0.546 | 0.659 | 0.682 | 0.552 | 0.547 | 0.472 | 0.541 | 0.495 | 0.469 | 0.528 | 0.588 | 0.627 | 0.66 | 0.542 | 0.46 | 0.69 | 0.672 | 0.486 | 0.615 | 0.645 | 0.563 | 0.597 | 0.487 | 0.478 | 0.542 | 0.523 | 0.641 | 0.633 | 0.631 | 0.664 | 0.545 | 0.569 | 0.547 | 0.629 | 0.447 | 0.632 | 0.631 | 0.532 | 0.608 | 0.686 | 0.636 | 0.526 | 0.455 | 0.675 | 0.662 | 0.545 | 0.627 | 0.645 | 0.56 | 0.526 | 0.537 | 0.671 | 0.633 | 0.533 | 0.443 | 0.672 | 0.529 | 0.527 | 0.556 | 0.446 | 0.478 | 0.545 | 0.665 | 0.466 | 0.484 | 0.426 | 0.532 | 0.664 | 0.604 | 0.549 | 0.542 | 0.615 | 0.592 | 0.678 | 0.673 | 0.535 | 0.65 | 0.661 | 0.446 | 0.54 | 0.567 | 0.642 | 0.614 | 0.612 | 0.633 | 0.635 | 0.463 | 0.659 | 0.555 | 0.659 | 0.547 | 0.518 | 0.627 | 0.576 | 0.695 | 0.557 | 0.46 | 0.502 | 0.532 | 0.633 | 0.435 | 0.484 | 0.608 | 0.557 | 0.643 | 0.632 | 0.659 | 0.605 | 0.478 | 0.599 | 0.661 | 0.462 | 0.55 | 0.592 | 0.68 | 0.683 | 0.441 | 0.608 | 0.676 | 0.512 | 0.673 | 0.462 | 0.554 | 0.483 | 0.677 | 0.593 | 0.622 | 0.68 | 0.538 | 0.523 | 0.691 | 0.714 | 0.652 | 0.639 | 0.443 | 0.541 | 0.529 | 0.542 | 0.536 | 0.527 | 0.526 | 0.606 | 0.54 | 0.608 | 0.661 | 0.534 | 0.677 | 0.54 | 0.688 | 0.663 | 0.641 | 0.619 | 0.426 | 0.62 | 0.562 | 0.513 | 0.585 | 0.648 | 0.521 | 0.47 | 0.67 | 0.52 | 0.513 | 0.557 | 0.659 | 0.566 | 0.659 | 0.435 | 0.643 | 0.508 | 0.455 | 0.548 | 0.629 | 0.562 | 0.527 | 0.688 | 0.707 | 0.535 | 0.508 | 0.471 | 0.621 | 0.542 | 0.427 | 0.559 | 0.591 | 0.676 | 0.69 | 0.581 | 0.56 | 0.542 | 0.439 | 0.609 | 0.686 | 0.543 | 0.642 | 0.665 | 0.55 | 0.52 | 0.54 | 0.694 | 0.542 | 0.614 | 0.662 | 0.559 | 0.571 | 0.665 | 0.652 | 0.546 | 0.673 | 0.556 | 0.665 | 0.652 | 0.656 | 0.505 | 0.685 | 0.536 | 0.537 | 0.463 | 0.684 | 0.56 | 0.657 | 0.602 |